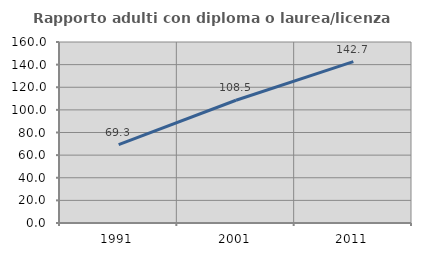
| Category | Rapporto adulti con diploma o laurea/licenza media  |
|---|---|
| 1991.0 | 69.35 |
| 2001.0 | 108.52 |
| 2011.0 | 142.702 |